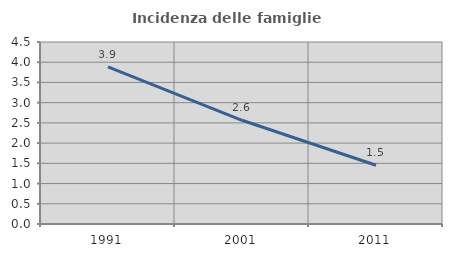
| Category | Incidenza delle famiglie numerose |
|---|---|
| 1991.0 | 3.887 |
| 2001.0 | 2.564 |
| 2011.0 | 1.452 |